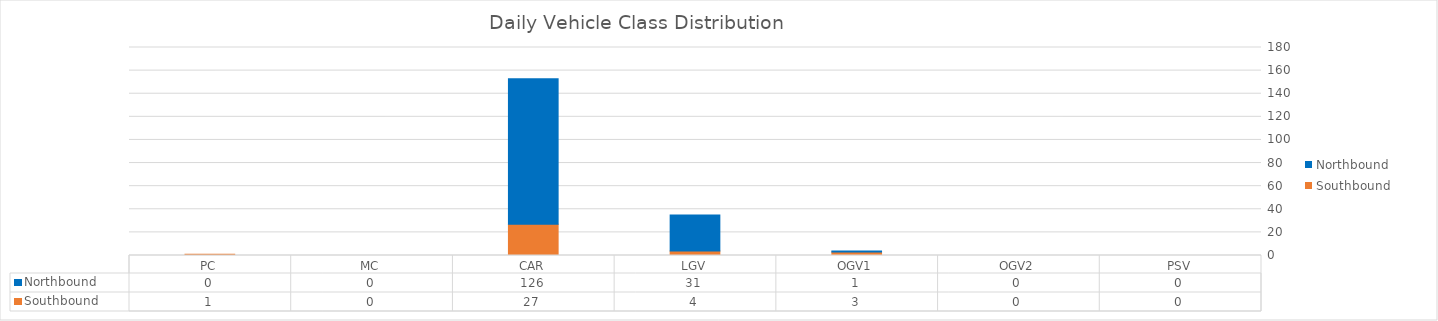
| Category | Southbound | Northbound |
|---|---|---|
| PC | 1 | 0 |
| MC | 0 | 0 |
| CAR | 27 | 126 |
| LGV | 4 | 31 |
| OGV1 | 3 | 1 |
| OGV2 | 0 | 0 |
| PSV | 0 | 0 |